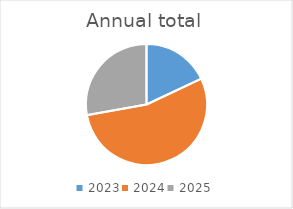
| Category | Annual total |
|---|---|
| 2023 | 174000 |
| 2024 | 524000 |
| 2025 | 269000 |